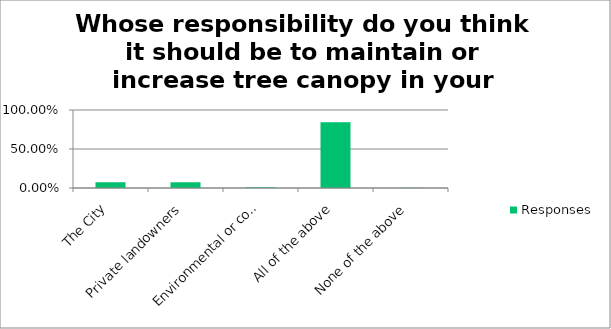
| Category | Responses |
|---|---|
| The City | 0.074 |
| Private landowners | 0.073 |
| Environmental or community organizations | 0.008 |
| All of the above | 0.842 |
| None of the above | 0.002 |